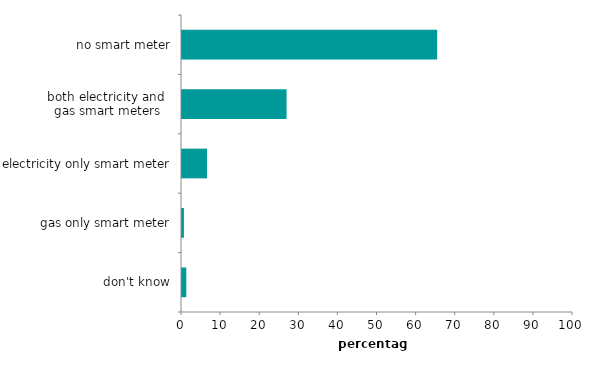
| Category | Series 1 |
|---|---|
| don't know | 1.103 |
| gas only smart meter | 0.491 |
| electricity only smart meter | 6.403 |
| both electricity and 
gas smart meters | 26.741 |
| no smart meter | 65.262 |